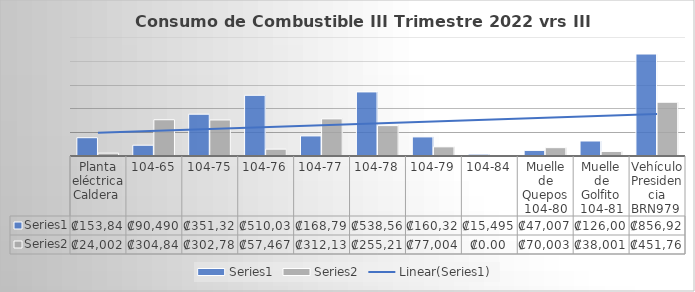
| Category | Series 0 | Series 1 |
|---|---|---|
| Planta eléctrica Caldera  | 153846 | 24002 |
| 104-65 | 90490 | 304848 |
| 104-75 | 351320 | 302786 |
| 104-76 | 510030 | 57467 |
| 104-77 | 168797 | 312134 |
| 104-78 | 538568 | 255215 |
| 104-79 | 160323 | 77004 |
| 104-84 | 15495 | 0 |
| Muelle de Quepos 104-80 | 47007 | 70003 |
| Muelle de Golfito 104-81 | 126007 | 38001 |
| Vehículo Presidencia BRN979  | 856922 | 451762 |